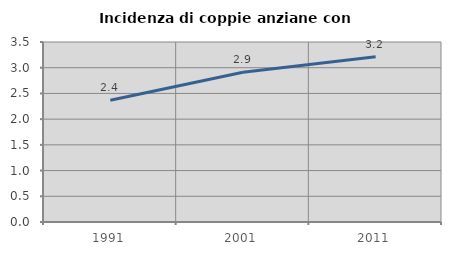
| Category | Incidenza di coppie anziane con figli |
|---|---|
| 1991.0 | 2.369 |
| 2001.0 | 2.911 |
| 2011.0 | 3.213 |